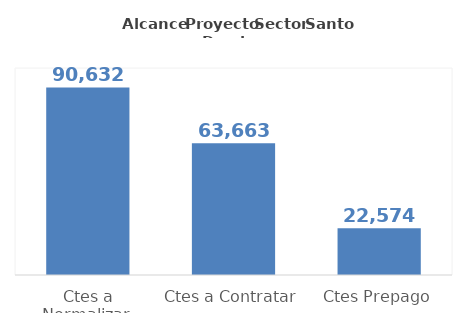
| Category | Series 0 |
|---|---|
| Ctes a Normalizar  | 90632.424 |
| Ctes a Contratar | 63663.49 |
| Ctes Prepago | 22573.6 |